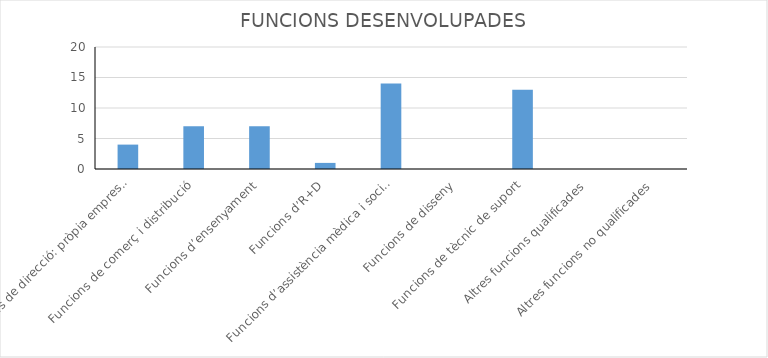
| Category | Series 0 |
|---|---|
| Funcions de direcció: pròpia empresa, direcció, producció, financera, etc. | 4 |
| Funcions de comerç i distribució | 7 |
| Funcions d’ensenyament | 7 |
| Funcions d’R+D | 1 |
| Funcions d’assistència mèdica i social | 14 |
| Funcions de disseny | 0 |
| Funcions de tècnic de suport | 13 |
| Altres funcions qualificades | 0 |
| Altres funcions no qualificades | 0 |